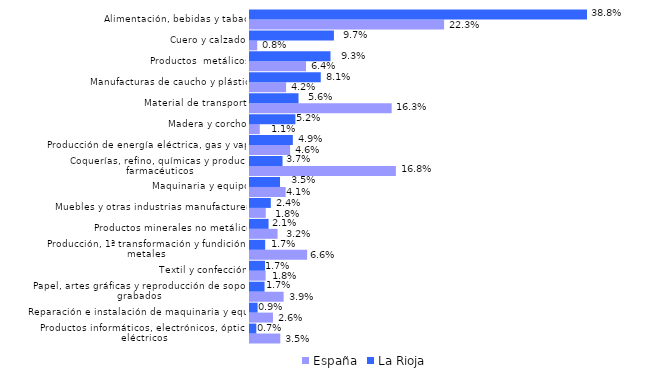
| Category | España | La Rioja |
|---|---|---|
| Productos informáticos, electrónicos, ópticos y eléctricos | 0.035 | 0.007 |
| Reparación e instalación de maquinaria y equipo | 0.026 | 0.009 |
| Papel, artes gráficas y reproducción de soportes grabados | 0.039 | 0.017 |
| Textil y confección | 0.018 | 0.017 |
| Producción, 1ª transformación y fundición de metales | 0.066 | 0.017 |
| Productos minerales no metálicos | 0.032 | 0.021 |
| Muebles y otras industrias manufactureras | 0.018 | 0.024 |
| Maquinaria y equipo | 0.041 | 0.035 |
| Coquerías, refino, químicas y productos farmacéuticos | 0.168 | 0.037 |
| Producción de energía eléctrica, gas y vapor | 0.046 | 0.049 |
| Madera y corcho | 0.011 | 0.052 |
| Material de transporte | 0.163 | 0.056 |
| Manufacturas de caucho y plástico | 0.042 | 0.081 |
| Productos  metálicos | 0.064 | 0.093 |
| Cuero y calzado | 0.008 | 0.097 |
| Alimentación, bebidas y tabaco | 0.223 | 0.388 |